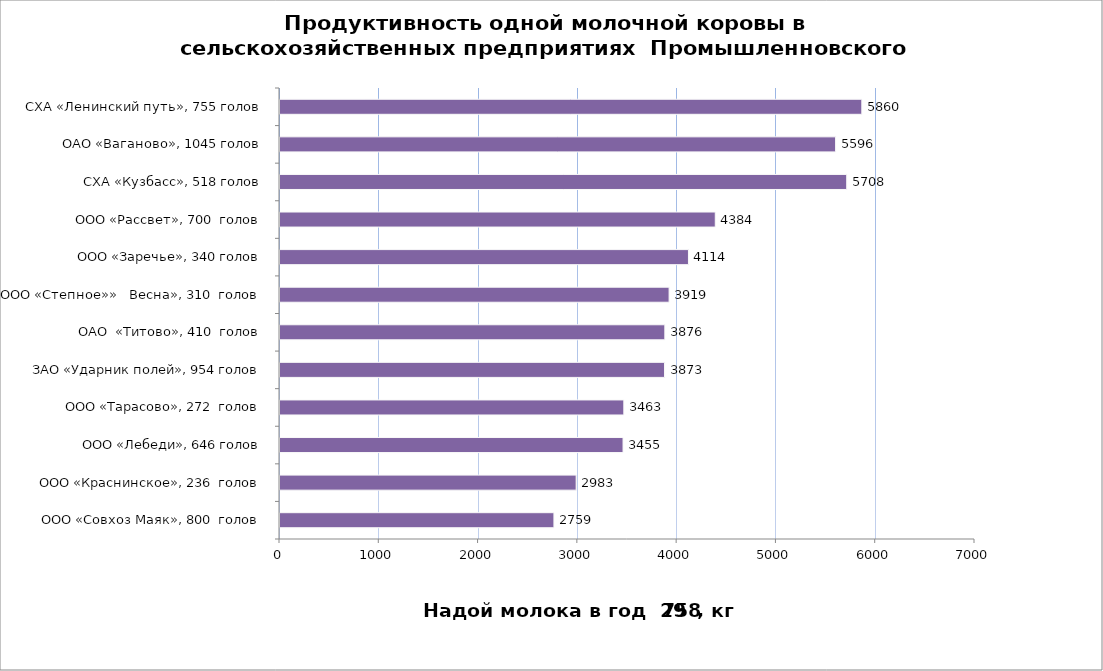
| Category | Series 0 |
|---|---|
| ООО «Совхоз Маяк», 800  голов | 2759 |
| ООО «Краснинское», 236  голов | 2983 |
| ООО «Лебеди», 646 голов | 3455 |
| ООО «Тарасово», 272  голов | 3463 |
| ЗАО «Ударник полей», 954 голов | 3873 |
| ОАО  «Титово», 410  голов | 3876 |
| ООО «Степное»»   Весна», 310  голов | 3919 |
| ООО «Заречье», 340 голов | 4114 |
| ООО «Рассвет», 700  голов | 4384 |
| СХА «Кузбасс», 518 голов | 5708 |
| ОАО «Ваганово», 1045 голов | 5596 |
| СХА «Ленинский путь», 755 голов | 5860 |